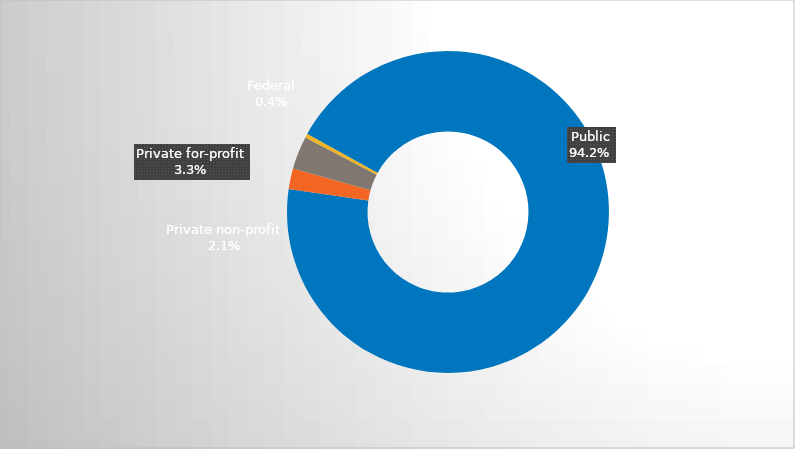
| Category | Series 0 |
|---|---|
| Public | 0.942 |
| Private non-profit | 0.021 |
| Private for-profit | 0.033 |
| Federal | 0.004 |